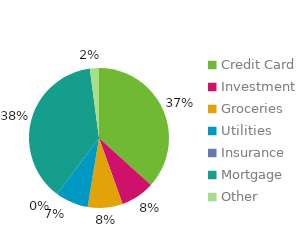
| Category | Item |
|---|---|
| Credit Card | 936.48 |
| Investment | 200 |
| Groceries | 205.61 |
| Utilities | 194.2 |
| Insurance | 0 |
| Mortgage | 961.77 |
| Other | 53.65 |